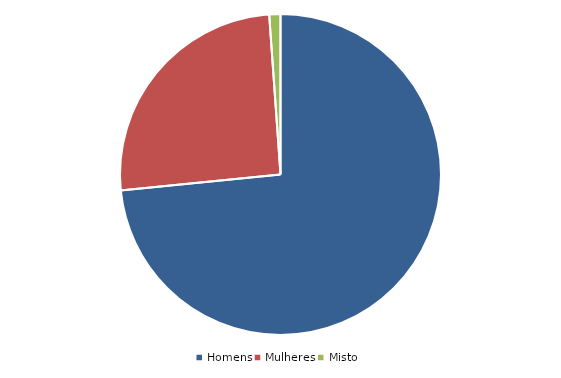
| Category | Percentagem |
|---|---|
| Homens | 73.418 |
| Mulheres | 25.457 |
| Misto | 1.125 |